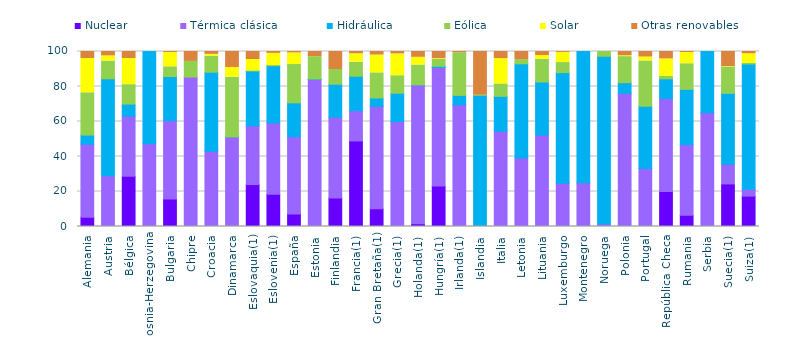
| Category | Nuclear | Térmica clásica | Hidráulica | Eólica | Solar | Otras renovables |
|---|---|---|---|---|---|---|
| Alemania | 5.314 | 41.762 | 5.157 | 24.187 | 19.591 | 3.989 |
| Austria | 0 | 29.007 | 55.409 | 10.099 | 2.97 | 2.516 |
| Bélgica | 28.717 | 34.299 | 6.93 | 11.107 | 14.959 | 3.988 |
| Bosnia-Herzegovina | 0 | 47.231 | 52.769 | 0 | 0 | 0 |
| Bulgaria | 15.747 | 44.742 | 25.226 | 5.522 | 8.216 | 0.547 |
| Chipre | 0 | 85.394 | 0 | 8.955 | 0 | 5.651 |
| Croacia | 0 | 42.934 | 45.225 | 9.186 | 1.028 | 1.627 |
| Dinamarca | 0 | 51.148 | 0.046 | 34.14 | 5.535 | 9.132 |
| Eslovaquia(1) | 23.965 | 33.576 | 31.292 | 0.037 | 6.572 | 4.558 |
| Eslovenia(1) | 18.443 | 40.729 | 32.673 | 0.089 | 6.98 | 1.086 |
| España | 7.193 | 44.127 | 19.333 | 21.9 | 6.624 | 0.823 |
| Estonia | 0 | 84.028 | 0.267 | 12.762 | 0.022 | 2.921 |
| Finlandia | 16.354 | 46.1 | 18.853 | 8.418 | 0 | 10.276 |
| Francia(1) | 48.893 | 17.297 | 19.696 | 7.996 | 4.799 | 1.319 |
| Gran Bretaña(1) | 10.105 | 58.542 | 4.794 | 14.35 | 10.198 | 2.012 |
| Grecia(1) | 0 | 59.913 | 16.237 | 10.011 | 12.466 | 1.373 |
| Holanda(1) | 1.508 | 79.323 | 0.118 | 11.294 | 4.433 | 3.325 |
| Hungría(1) | 23.08 | 67.772 | 0.697 | 4.012 | 0.355 | 4.085 |
| Irlanda(1) | 0 | 69.541 | 5.391 | 24.23 | 0 | 0.838 |
| Islandia | 0 | 0.408 | 74.545 | 0.068 | 0 | 24.979 |
| Italia | 0 | 54.475 | 19.907 | 7.066 | 14.475 | 4.077 |
| Letonia | 0 | 39.162 | 53.783 | 2.42 | 0 | 4.635 |
| Lituania | 0 | 52.233 | 30.346 | 12.955 | 2.159 | 2.307 |
| Luxemburgo | 0 | 24.689 | 63.254 | 5.742 | 5.789 | 0.526 |
| Montenegro | 0 | 25 | 75 | 0 | 0 | 0 |
| Noruega | 0 | 1.389 | 95.898 | 2.708 | 0 | 0.005 |
| Polonia | 0 | 76.025 | 6.168 | 14.883 | 0.486 | 2.437 |
| Portugal | 0 | 33.102 | 35.617 | 25.876 | 2.252 | 3.153 |
| República Checa | 20.012 | 53.175 | 11.19 | 1.372 | 10.041 | 4.21 |
| Rumania | 6.412 | 40.372 | 31.592 | 14.625 | 6.417 | 0.582 |
| Serbia | 0 | 64.975 | 35.025 | 0 | 0 | 0 |
| Suecia(1) | 24.315 | 11.266 | 40.51 | 15.091 | 0.26 | 8.558 |
| Suiza(1) | 17.367 | 3.882 | 71.618 | 0.313 | 5.528 | 1.292 |